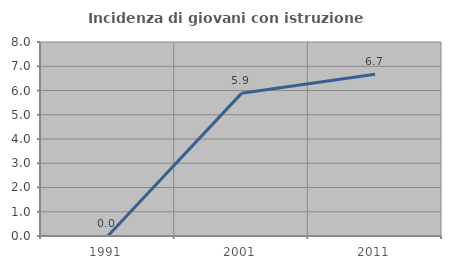
| Category | Incidenza di giovani con istruzione universitaria |
|---|---|
| 1991.0 | 0 |
| 2001.0 | 5.882 |
| 2011.0 | 6.667 |